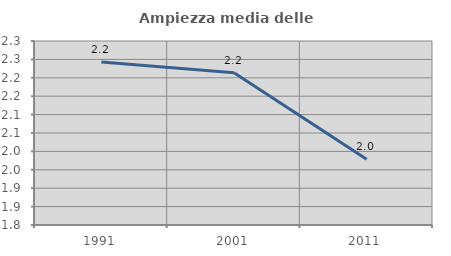
| Category | Ampiezza media delle famiglie |
|---|---|
| 1991.0 | 2.243 |
| 2001.0 | 2.214 |
| 2011.0 | 1.979 |